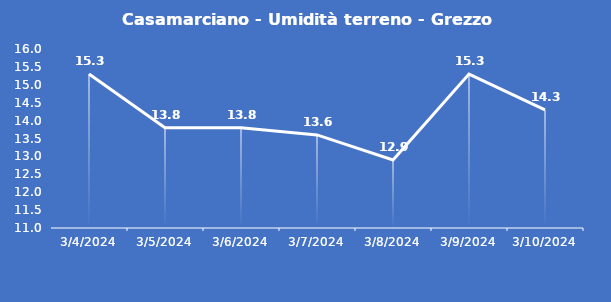
| Category | Casamarciano - Umidità terreno - Grezzo (%VWC) |
|---|---|
| 3/4/24 | 15.3 |
| 3/5/24 | 13.8 |
| 3/6/24 | 13.8 |
| 3/7/24 | 13.6 |
| 3/8/24 | 12.9 |
| 3/9/24 | 15.3 |
| 3/10/24 | 14.3 |